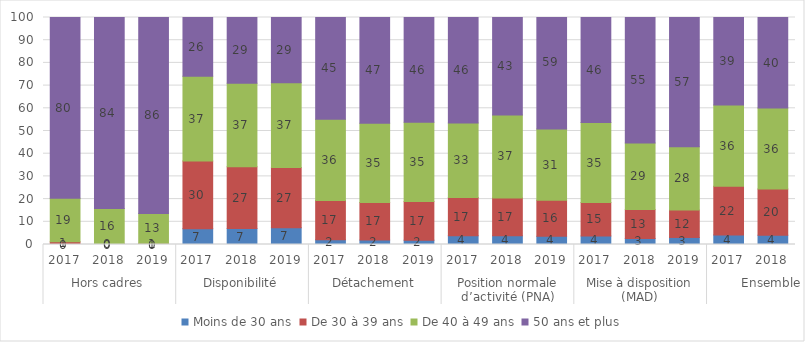
| Category | Moins de 30 ans | De 30 à 39 ans | De 40 à 49 ans | 50 ans et plus |
|---|---|---|---|---|
| 0 | 0 | 1.207 | 19.115 | 79.678 |
| 1 | 0 | 0.273 | 15.574 | 84.153 |
| 2 | 0 | 0.5 | 13.2 | 86.3 |
| 3 | 6.993 | 29.772 | 37.382 | 25.852 |
| 4 | 7.015 | 27.211 | 36.825 | 28.948 |
| 5 | 7.4 | 26.5 | 37.4 | 28.7 |
| 6 | 2.087 | 17.258 | 35.78 | 44.875 |
| 7 | 1.942 | 16.569 | 34.859 | 46.63 |
| 8 | 1.9 | 17 | 34.9 | 46.2 |
| 9 | 3.877 | 16.847 | 32.782 | 46.494 |
| 10 | 3.858 | 16.662 | 36.538 | 42.942 |
| 11 | 3.6 | 15.9 | 31.4 | 59.2 |
| 12 | 3.768 | 14.7 | 35.238 | 46.294 |
| 13 | 2.643 | 12.73 | 29.391 | 55.235 |
| 14 | 3.1 | 12.1 | 27.9 | 56.9 |
| 15 | 4.2 | 21.5 | 35.7 | 38.6 |
| 16 | 4.1 | 20.3 | 35.7 | 39.9 |